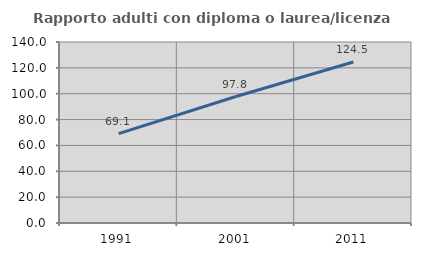
| Category | Rapporto adulti con diploma o laurea/licenza media  |
|---|---|
| 1991.0 | 69.149 |
| 2001.0 | 97.826 |
| 2011.0 | 124.49 |